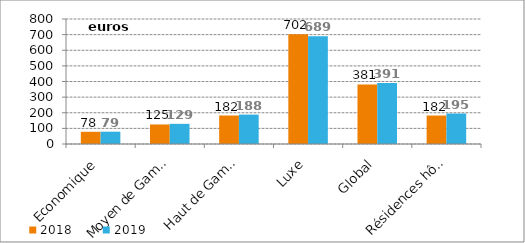
| Category | 2018 | 2019 |
|---|---|---|
| Economique | 78.085 | 78.825 |
| Moyen de Gamme | 125.063 | 128.982 |
| Haut de Gamme | 182.377 | 188.234 |
| Luxe | 701.961 | 689.271 |
| Global | 380.876 | 391.11 |
| Résidences hôtelières | 182.145 | 195.08 |